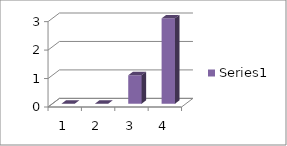
| Category | Series 0 |
|---|---|
| 0 | 0 |
| 1 | 0 |
| 2 | 1 |
| 3 | 3 |